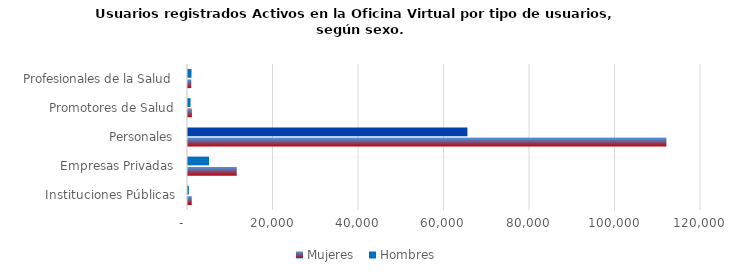
| Category | Mujeres | Hombres |
|---|---|---|
| Instituciones Públicas | 882 | 197 |
| Empresas Privadas | 11401 | 4931 |
| Personales | 111907 | 65362 |
| Promotores de Salud | 913 | 596 |
| Profesionales de la Salud | 762 | 816 |